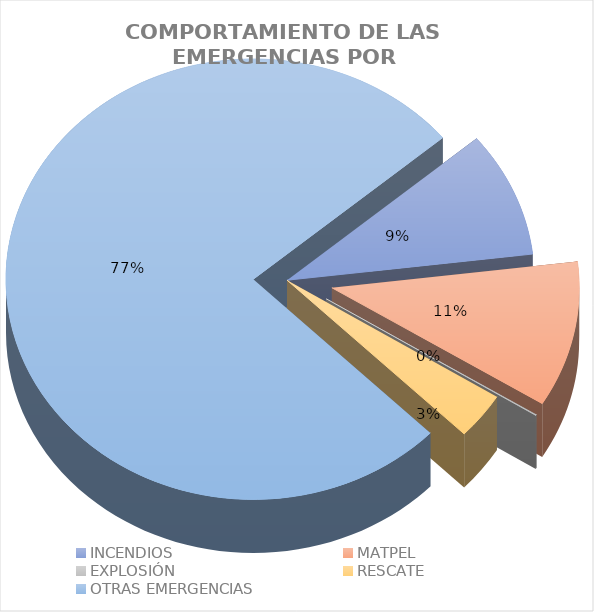
| Category | Series 0 |
|---|---|
| INCENDIOS | 0.092 |
| MATPEL | 0.107 |
| EXPLOSIÓN | 0.001 |
| RESCATE | 0.034 |
| OTRAS EMERGENCIAS | 0.766 |